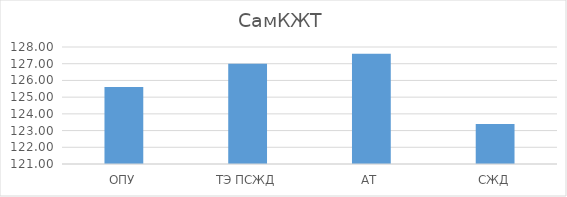
| Category | Series 0 |
|---|---|
| ОПУ | 125.6 |
| ТЭ ПСЖД | 127 |
| АТ | 127.6 |
| СЖД | 123.4 |